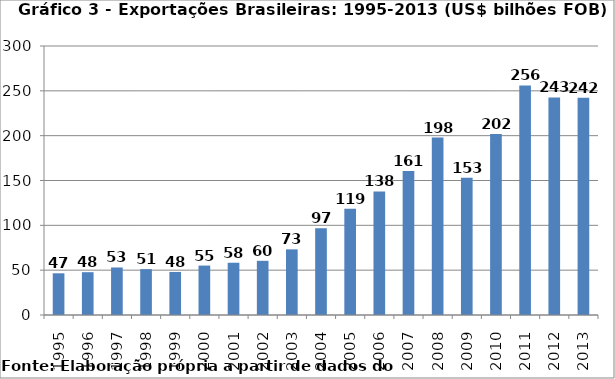
| Category | Series 0 |
|---|---|
| 1995.0 | 46.506 |
| 1996.0 | 47.747 |
| 1997.0 | 52.983 |
| 1998.0 | 51.14 |
| 1999.0 | 48.013 |
| 2000.0 | 55.119 |
| 2001.0 | 58.287 |
| 2002.0 | 60.439 |
| 2003.0 | 73.203 |
| 2004.0 | 96.677 |
| 2005.0 | 118.529 |
| 2006.0 | 137.807 |
| 2007.0 | 160.649 |
| 2008.0 | 197.942 |
| 2009.0 | 152.995 |
| 2010.0 | 201.915 |
| 2011.0 | 256.04 |
| 2012.0 | 242.578 |
| 2013.0 | 242.179 |